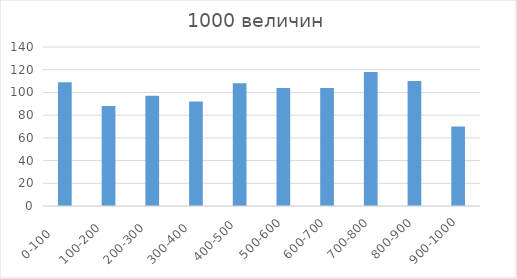
| Category | Series 0 |
|---|---|
| 0-100     | 109 |
| 100-200   | 88 |
| 200-300   | 97 |
| 300-400   | 92 |
| 400-500  | 108 |
| 500-600 | 104 |
| 600-700 | 104 |
| 700-800 | 118 |
| 800-900 | 110 |
| 900-1000 | 70 |